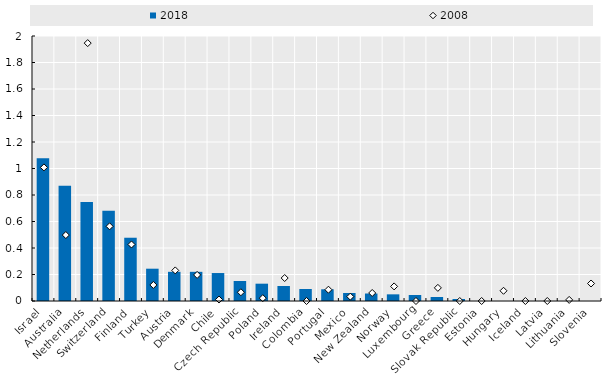
| Category | 2018 |
|---|---|
| Israel | 1.078 |
| Australia | 0.87 |
| Netherlands | 0.746 |
| Switzerland | 0.68 |
| Finland | 0.477 |
| Turkey | 0.244 |
| Austria | 0.22 |
| Denmark | 0.22 |
| Chile | 0.211 |
| Czech Republic | 0.151 |
| Poland | 0.131 |
| Ireland | 0.113 |
| Colombia | 0.09 |
| Portugal | 0.088 |
| Mexico | 0.06 |
| New Zealand | 0.057 |
| Norway | 0.05 |
| Luxembourg | 0.045 |
| Greece | 0.03 |
| Slovak Republic | 0.015 |
| Estonia | 0 |
| Hungary | 0 |
| Iceland | 0 |
| Latvia | 0 |
| Lithuania | 0 |
| Slovenia | 0 |